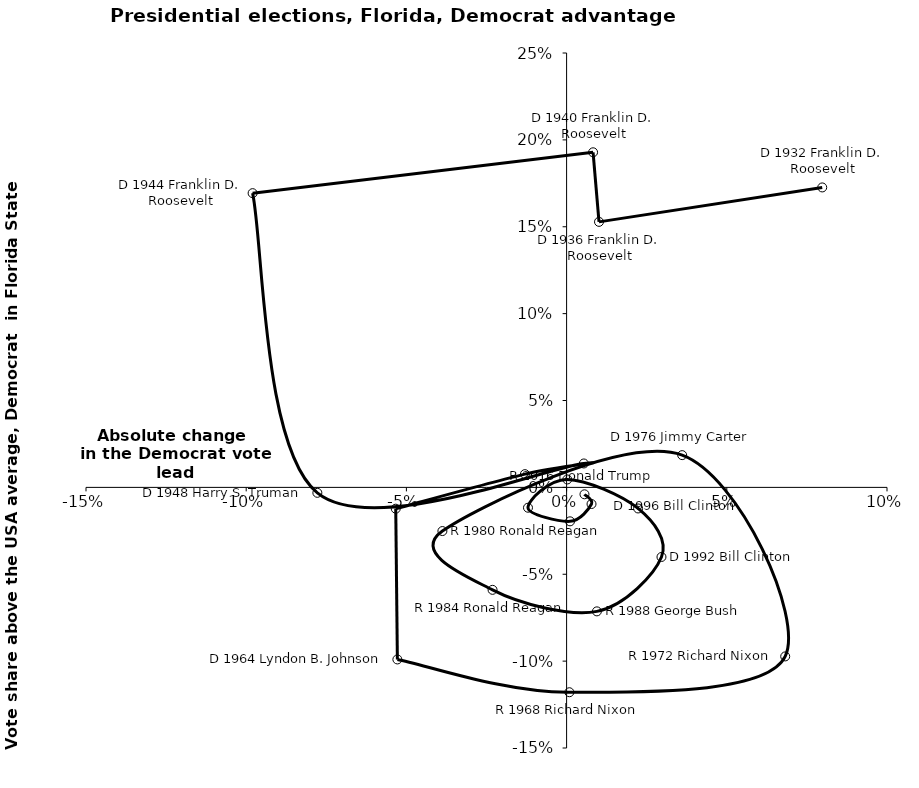
| Category | Series 0 |
|---|---|
| 0.0797837158560096 | 0.173 |
| 0.010114530609959094 | 0.153 |
| 0.008263158312248331 | 0.193 |
| -0.09799848812728584 | 0.169 |
| -0.07779100911068526 | -0.003 |
| 0.0053804115884109605 | 0.014 |
| -0.013012294636001204 | 0.008 |
| -0.05332529254749685 | -0.012 |
| -0.052817815840236954 | -0.099 |
| 0.0008727663430503074 | -0.118 |
| 0.06822826652371211 | -0.097 |
| 0.03607206081429892 | 0.019 |
| -0.03876500091447865 | -0.025 |
| -0.023110277907393534 | -0.059 |
| 0.009456436863545498 | -0.071 |
| 0.02961197417892017 | -0.04 |
| 0.022313383541153337 | -0.012 |
| 0.00021344432629613608 | 0.005 |
| -0.012053783330240986 | -0.012 |
| 0.0010704520472638035 | -0.02 |
| 0.007778259040340463 | -0.01 |
| 0.005581597039286512 | -0.004 |